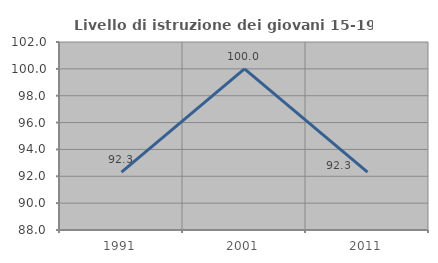
| Category | Livello di istruzione dei giovani 15-19 anni |
|---|---|
| 1991.0 | 92.308 |
| 2001.0 | 100 |
| 2011.0 | 92.308 |